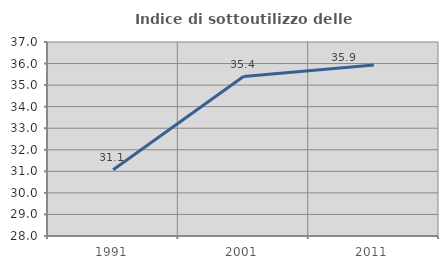
| Category | Indice di sottoutilizzo delle abitazioni  |
|---|---|
| 1991.0 | 31.07 |
| 2001.0 | 35.399 |
| 2011.0 | 35.936 |